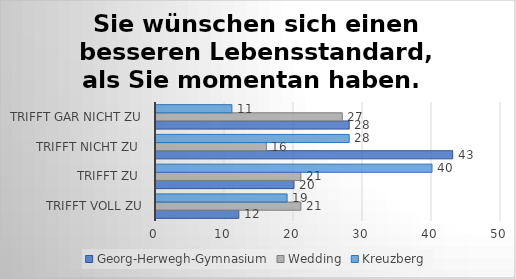
| Category | Georg-Herwegh-Gymnasium | Wedding | Kreuzberg |
|---|---|---|---|
| trifft voll zu | 12 | 21 | 19 |
| trifft zu  | 20 | 21 | 40 |
| trifft nicht zu  | 43 | 16 | 28 |
| trifft gar nicht zu | 28 | 27 | 11 |